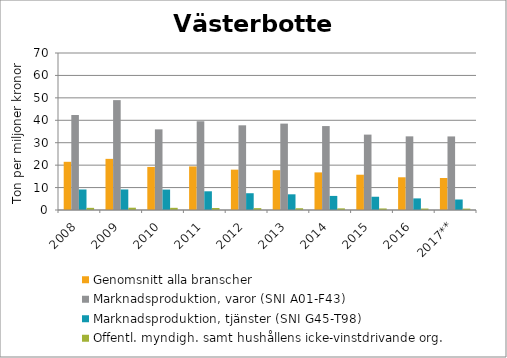
| Category | Genomsnitt alla branscher | Marknadsproduktion, varor (SNI A01-F43) | Marknadsproduktion, tjänster (SNI G45-T98) | Offentl. myndigh. samt hushållens icke-vinstdrivande org. |
|---|---|---|---|---|
| 2008 | 21.489 | 42.35 | 9.148 | 0.959 |
| 2009 | 22.803 | 48.987 | 9.16 | 1.023 |
| 2010 | 19.202 | 35.953 | 9.104 | 0.973 |
| 2011 | 19.423 | 39.542 | 8.341 | 0.886 |
| 2012 | 17.992 | 37.759 | 7.479 | 0.836 |
| 2013 | 17.747 | 38.514 | 6.995 | 0.784 |
| 2014 | 16.766 | 37.423 | 6.281 | 0.735 |
| 2015 | 15.731 | 33.615 | 5.912 | 0.693 |
| 2016 | 14.588 | 32.835 | 5.173 | 0.65 |
| 2017** | 14.274 | 32.801 | 4.68 | 0.616 |